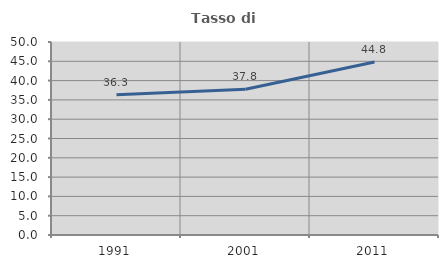
| Category | Tasso di occupazione   |
|---|---|
| 1991.0 | 36.311 |
| 2001.0 | 37.777 |
| 2011.0 | 44.818 |